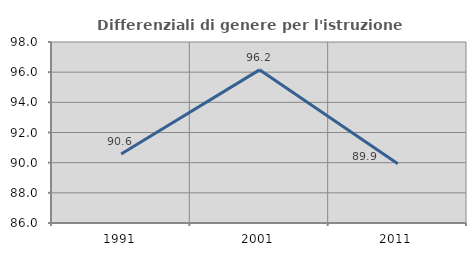
| Category | Differenziali di genere per l'istruzione superiore |
|---|---|
| 1991.0 | 90.575 |
| 2001.0 | 96.153 |
| 2011.0 | 89.935 |